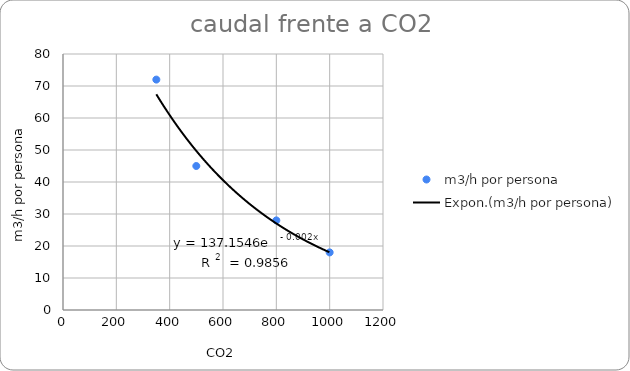
| Category | m3/h por persona |
|---|---|
| 350.0 | 72 |
| 500.0 | 45 |
| 800.0 | 28 |
| 1000.0 | 18 |